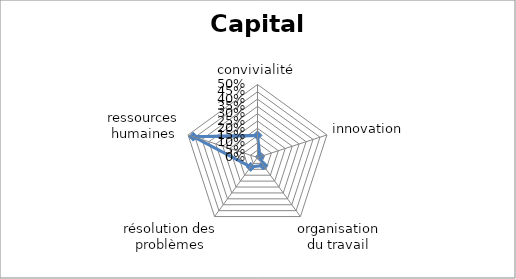
| Category | Series 0 |
|---|---|
| convivialité | 0.151 |
| innovation | 0.017 |
| organisation du travail | 0.068 |
| résolution des problèmes | 0.079 |
| ressources humaines | 0.462 |